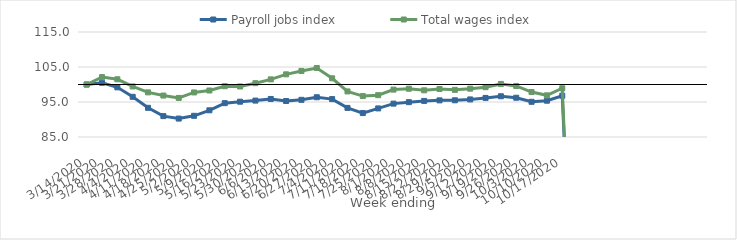
| Category | Payroll jobs index | Total wages index |
|---|---|---|
| 14/03/2020 | 100 | 100 |
| 21/03/2020 | 100.486 | 102.108 |
| 28/03/2020 | 99.19 | 101.492 |
| 04/04/2020 | 96.482 | 99.439 |
| 11/04/2020 | 93.339 | 97.753 |
| 18/04/2020 | 90.965 | 96.842 |
| 25/04/2020 | 90.264 | 96.165 |
| 02/05/2020 | 91.057 | 97.73 |
| 09/05/2020 | 92.625 | 98.283 |
| 16/05/2020 | 94.666 | 99.512 |
| 23/05/2020 | 95.088 | 99.437 |
| 30/05/2020 | 95.403 | 100.379 |
| 06/06/2020 | 95.864 | 101.466 |
| 13/06/2020 | 95.283 | 102.903 |
| 20/06/2020 | 95.618 | 103.879 |
| 27/06/2020 | 96.361 | 104.716 |
| 04/07/2020 | 95.831 | 101.771 |
| 11/07/2020 | 93.316 | 98.024 |
| 18/07/2020 | 91.839 | 96.695 |
| 25/07/2020 | 93.169 | 96.952 |
| 01/08/2020 | 94.535 | 98.541 |
| 08/08/2020 | 94.952 | 98.799 |
| 15/08/2020 | 95.311 | 98.338 |
| 22/08/2020 | 95.469 | 98.719 |
| 29/08/2020 | 95.487 | 98.466 |
| 05/09/2020 | 95.736 | 98.812 |
| 12/09/2020 | 96.165 | 99.229 |
| 19/09/2020 | 96.64 | 100.165 |
| 26/09/2020 | 96.216 | 99.583 |
| 03/10/2020 | 95.054 | 97.841 |
| 10/10/2020 | 95.375 | 96.905 |
| 17/10/2020 | 96.795 | 98.928 |